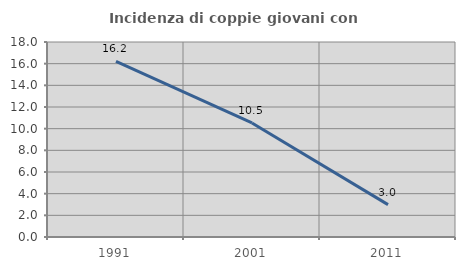
| Category | Incidenza di coppie giovani con figli |
|---|---|
| 1991.0 | 16.206 |
| 2001.0 | 10.526 |
| 2011.0 | 2.991 |